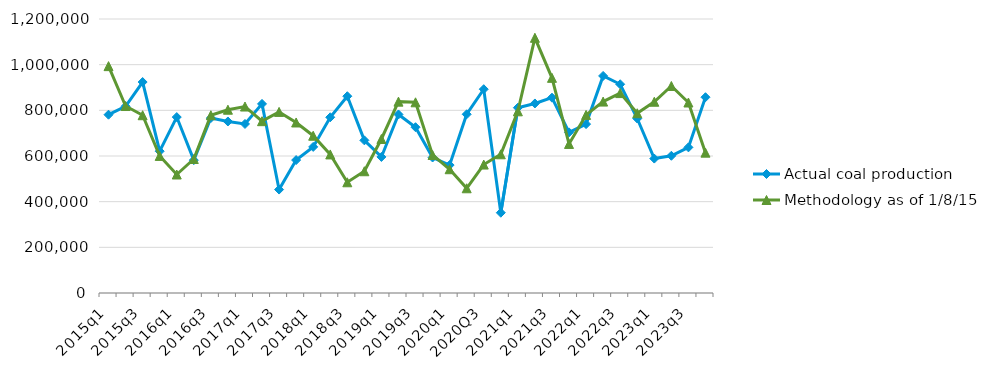
| Category | Actual coal production | Methodology as of 1/8/15 |
|---|---|---|
| 2015q1 | 780820 | 993568 |
| 2015q2 | 817677 | 818900 |
| 2015q3 | 923939 | 778577 |
| 2015q4 | 620956 | 600383 |
| 2016q1 | 770498 | 518967 |
| 2016q2 | 581868 | 586854 |
| 2016q3 | 766209 | 778546 |
| 2016q4 | 751165 | 802747 |
| 2017q1 | 740334 | 816651 |
| 2017q2 | 828163 | 752506 |
| 2017q3 | 453018 | 793144 |
| 2017q4 | 582153 | 746829 |
| 2018q1 | 639846 | 688812 |
| 2018q2 | 769595 | 606862 |
| 2018q3 | 861783 | 484955 |
| 2018q4 | 668514 | 533262 |
| 2019q1 | 595844 | 674579 |
| 2019q2 | 781998 | 838050 |
| 2019q3 | 726081 | 835170 |
| 2019q4 | 593408 | 604434 |
| 2020q1 | 560303 | 542052 |
| 2020q2 | 782736 | 458655 |
| 2020Q3 | 892554 | 562483 |
| 2020Q4 | 351572 | 607550 |
| 2021q1 | 811602 | 795677 |
| 2021q2 | 830089 | 1117663 |
| 2021q3 | 855452 | 942335 |
| 2021q4 | 703437 | 652807 |
| 2022q1 | 739680 | 780005 |
| 2022q2 | 950660 | 838342 |
| 2022q3 | 914120 | 875506 |
| 2022q4 | 764112 | 787267 |
| 2023q1 | 588693 | 837656 |
| 2023q2 | 600993 | 906657 |
| 2023q3 | 637813 | 834243 |
| 2023q4 | 857426 | 614656 |